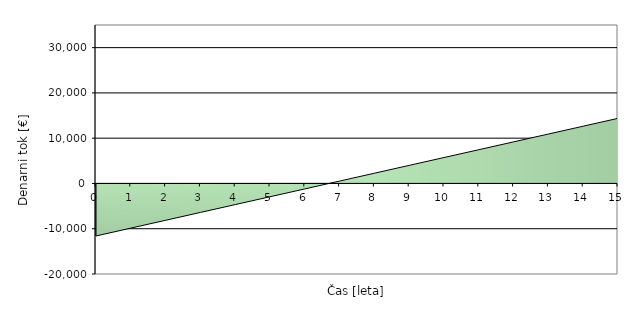
| Category | Series 0 |
|---|---|
| 0.0 | -11600 |
| 1.0 | -9867.737 |
| 2.0 | -8135.475 |
| 3.0 | -6403.212 |
| 4.0 | -4670.949 |
| 5.0 | -2938.686 |
| 6.0 | -1206.424 |
| 7.0 | 525.839 |
| 8.0 | 2258.102 |
| 9.0 | 3990.365 |
| 10.0 | 5722.627 |
| 11.0 | 7454.89 |
| 12.0 | 9187.153 |
| 13.0 | 10919.416 |
| 14.0 | 12651.678 |
| 15.0 | 14383.941 |